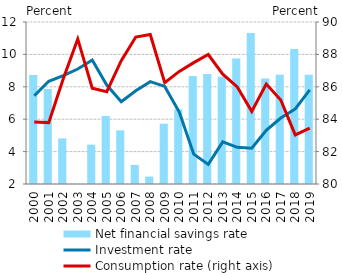
| Category | Net financial savings rate |
|---|---|
| 2000.0 | 8.728 |
| 2001.0 | 7.869 |
| 2002.0 | 4.815 |
| 2003.0 | 1.947 |
| 2004.0 | 4.431 |
| 2005.0 | 6.195 |
| 2006.0 | 5.309 |
| 2007.0 | 3.176 |
| 2008.0 | 2.458 |
| 2009.0 | 5.725 |
| 2010.0 | 6.61 |
| 2011.0 | 8.664 |
| 2012.0 | 8.795 |
| 2013.0 | 8.626 |
| 2014.0 | 9.748 |
| 2015.0 | 11.314 |
| 2016.0 | 8.512 |
| 2017.0 | 8.745 |
| 2018.0 | 10.336 |
| 2019.0 | 8.745 |